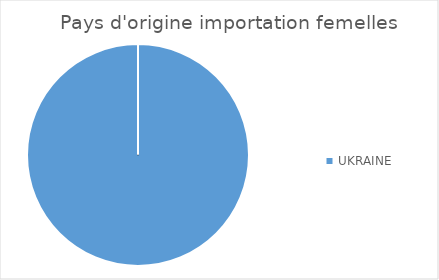
| Category | Series 0 |
|---|---|
| UKRAINE | 1 |